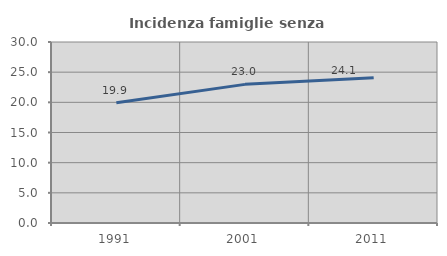
| Category | Incidenza famiglie senza nuclei |
|---|---|
| 1991.0 | 19.929 |
| 2001.0 | 22.979 |
| 2011.0 | 24.074 |